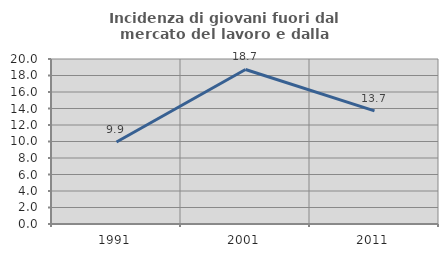
| Category | Incidenza di giovani fuori dal mercato del lavoro e dalla formazione  |
|---|---|
| 1991.0 | 9.946 |
| 2001.0 | 18.728 |
| 2011.0 | 13.706 |